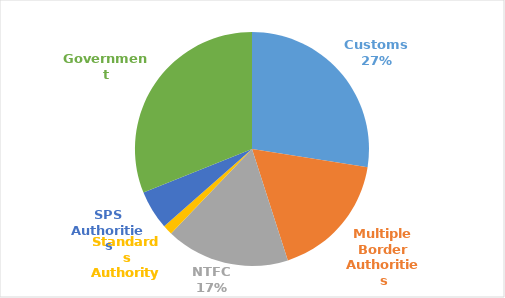
| Category | Share |
|---|---|
| Customs | 0.275 |
| Multiple Border Authorities | 0.176 |
| NTFC | 0.171 |
| Standards Authority | 0.014 |
| SPS Authorities | 0.054 |
| Government | 0.311 |